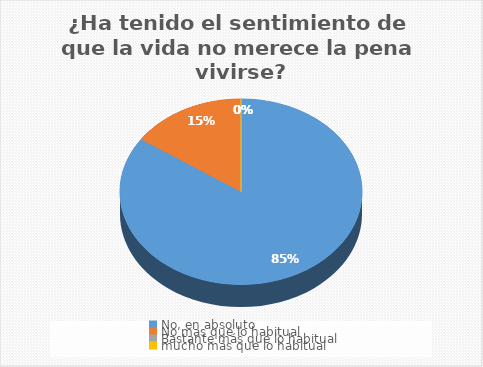
| Category | ¿Ha tenido el sentimiento de que la vida no merece la pena vivirse? |
|---|---|
| No, en absoluto  | 93 |
| No mas que lo habitual | 17 |
| Bastante más que lo habitual | 0 |
| mucho más que lo habitual | 0 |